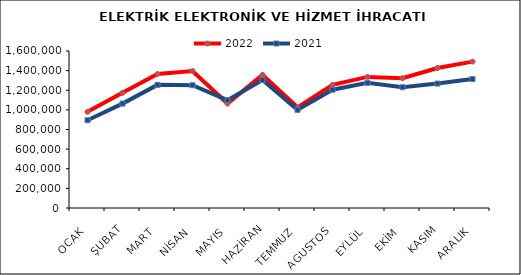
| Category | 2022 | 2021 |
|---|---|---|
| OCAK | 980433.661 | 894313.188 |
| ŞUBAT | 1173483.872 | 1063990.719 |
| MART | 1365464.596 | 1254784.99 |
| NİSAN | 1395667.09 | 1251377.391 |
| MAYIS | 1064462.998 | 1098886.839 |
| HAZİRAN | 1356845.191 | 1304135.266 |
| TEMMUZ | 1025974.222 | 1000010.468 |
| AGUSTOS | 1254266.74 | 1204900.743 |
| EYLÜL | 1335993.295 | 1276019.174 |
| EKİM | 1322161.845 | 1230948.353 |
| KASIM | 1426563.065 | 1267930.803 |
| ARALIK | 1492007.723 | 1313570.574 |